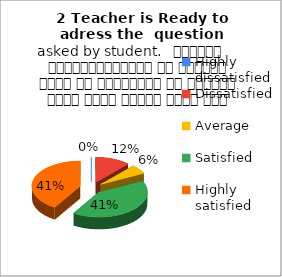
| Category | 2 Teacher is Ready to adress the  question asked by student.   शिक्षक विद्यार्थियों के द्वारा पूछे गए प्रश्नों का समाधान करने हेतु तत्पर रहते हैं |
|---|---|
| Highly dissatisfied | 0 |
| Dissatisfied | 2 |
| Average | 1 |
| Satisfied | 7 |
| Highly satisfied | 7 |